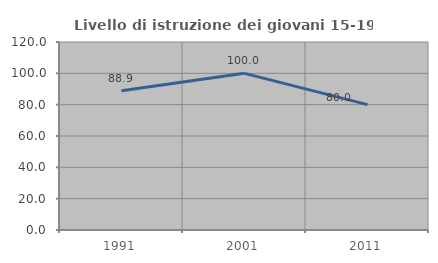
| Category | Livello di istruzione dei giovani 15-19 anni |
|---|---|
| 1991.0 | 88.889 |
| 2001.0 | 100 |
| 2011.0 | 80 |